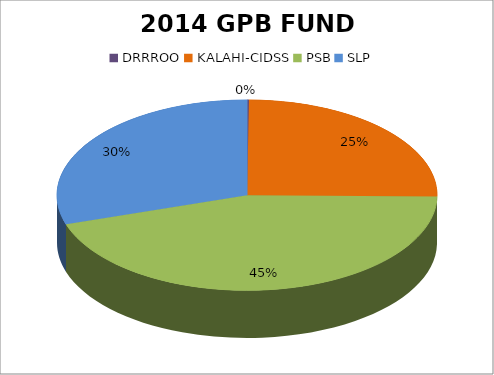
| Category | Series 0 |
|---|---|
| DRRROO | 4904705.88 |
| KALAHI-CIDSS | 741462982.348 |
| PSB | 1325017795.384 |
| SLP | 885213810.452 |